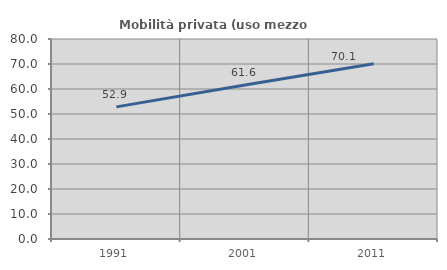
| Category | Mobilità privata (uso mezzo privato) |
|---|---|
| 1991.0 | 52.857 |
| 2001.0 | 61.635 |
| 2011.0 | 70.068 |